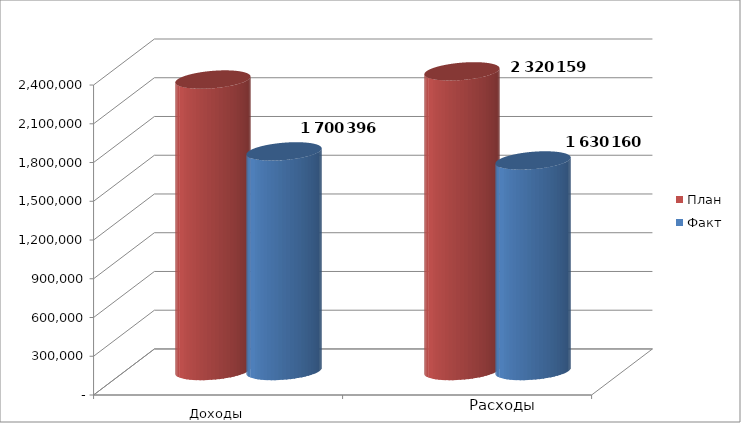
| Category | План | Факт |
|---|---|---|
| 0 | 2256784 | 1700396 |
| 1 | 2320159 | 1630159.7 |